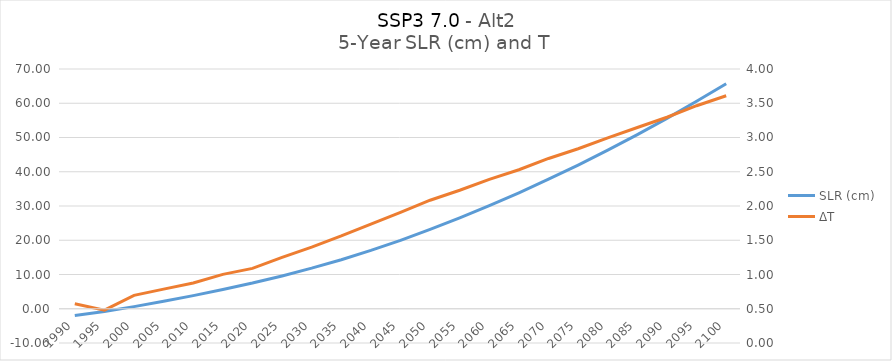
| Category | SLR (cm) |
|---|---|
| 1990.0 | -1.941 |
| 1995.0 | -0.818 |
| 2000.0 | 0.621 |
| 2005.0 | 2.18 |
| 2010.0 | 3.834 |
| 2015.0 | 5.633 |
| 2020.0 | 7.505 |
| 2025.0 | 9.582 |
| 2030.0 | 11.846 |
| 2035.0 | 14.321 |
| 2040.0 | 17.029 |
| 2045.0 | 19.966 |
| 2050.0 | 23.15 |
| 2055.0 | 26.517 |
| 2060.0 | 30.096 |
| 2065.0 | 33.844 |
| 2070.0 | 37.814 |
| 2075.0 | 41.959 |
| 2080.0 | 46.312 |
| 2085.0 | 50.859 |
| 2090.0 | 55.597 |
| 2095.0 | 60.565 |
| 2100.0 | 65.715 |